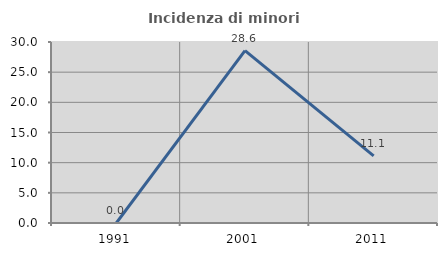
| Category | Incidenza di minori stranieri |
|---|---|
| 1991.0 | 0 |
| 2001.0 | 28.571 |
| 2011.0 | 11.111 |